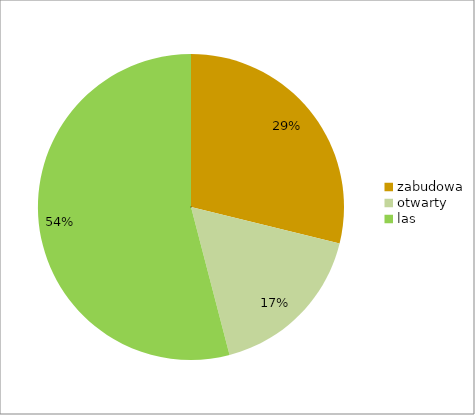
| Category | Series 0 |
|---|---|
| zabudowa | 0.288 |
| otwarty | 0.171 |
| las | 0.541 |